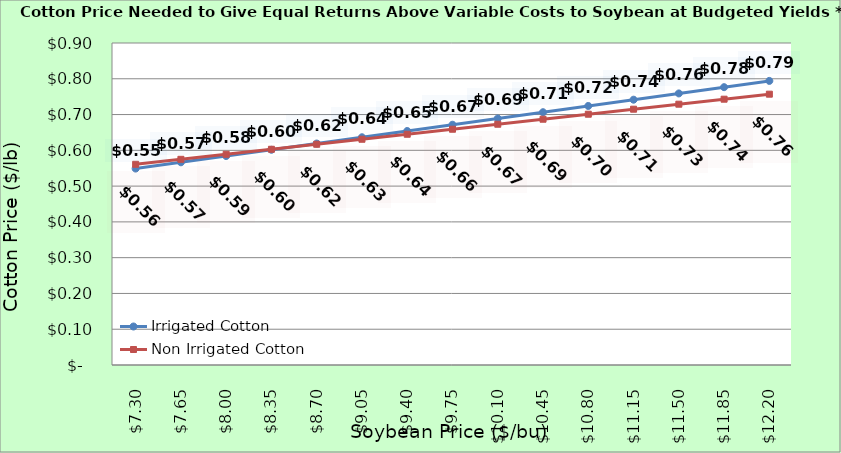
| Category | Irrigated Cotton | Non Irrigated Cotton |
|---|---|---|
| 7.3000000000000025 | 0.549 | 0.561 |
| 7.650000000000002 | 0.567 | 0.575 |
| 8.000000000000002 | 0.584 | 0.589 |
| 8.350000000000001 | 0.602 | 0.603 |
| 8.700000000000001 | 0.619 | 0.617 |
| 9.05 | 0.637 | 0.631 |
| 9.4 | 0.654 | 0.645 |
| 9.75 | 0.672 | 0.659 |
| 10.1 | 0.689 | 0.673 |
| 10.45 | 0.707 | 0.687 |
| 10.799999999999999 | 0.724 | 0.701 |
| 11.149999999999999 | 0.742 | 0.715 |
| 11.499999999999998 | 0.759 | 0.729 |
| 11.849999999999998 | 0.777 | 0.743 |
| 12.199999999999998 | 0.794 | 0.757 |